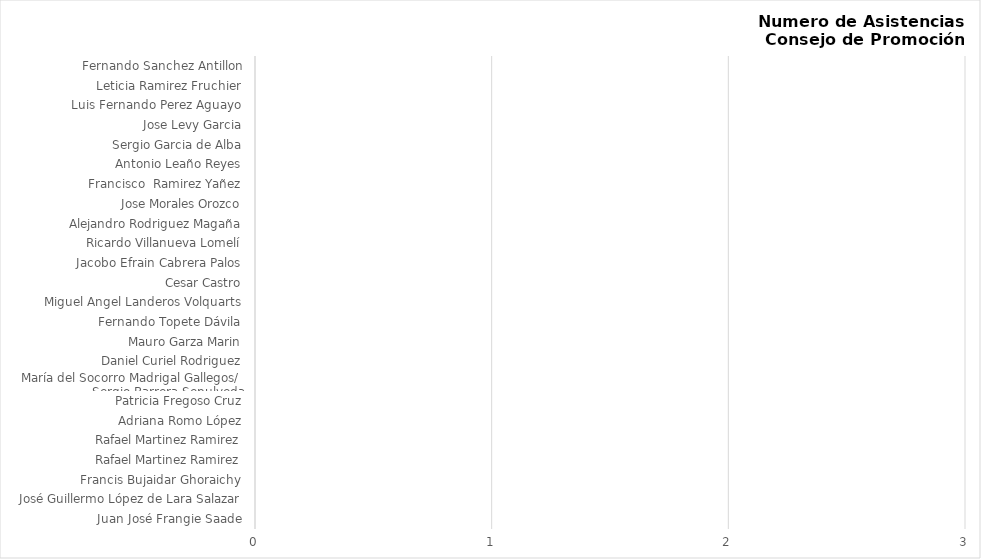
| Category | Series 0 |
|---|---|
| Juan José Frangie Saade | 0 |
| José Guillermo López de Lara Salazar | 0 |
| Francis Bujaidar Ghoraichy | 0 |
| Rafael Martinez Ramirez | 0 |
| Rafael Martinez Ramirez | 0 |
| Adriana Romo López | 0 |
| Patricia Fregoso Cruz | 0 |
| María del Socorro Madrigal Gallegos/ 
Sergio Barrera Sepulveda | 0 |
| Daniel Curiel Rodriguez | 0 |
| Mauro Garza Marin | 0 |
| Fernando Topete Dávila | 0 |
| Miguel Angel Landeros Volquarts | 0 |
| Cesar Castro | 0 |
| Jacobo Efrain Cabrera Palos | 0 |
| Ricardo Villanueva Lomelí | 0 |
| Alejandro Rodriguez Magaña | 0 |
|  Jose Morales Orozco | 0 |
| Francisco  Ramirez Yañez | 0 |
| Antonio Leaño Reyes | 0 |
| Sergio Garcia de Alba | 0 |
| Jose Levy Garcia | 0 |
| Luis Fernando Perez Aguayo | 0 |
| Leticia Ramirez Fruchier | 0 |
| Fernando Sanchez Antillon | 0 |